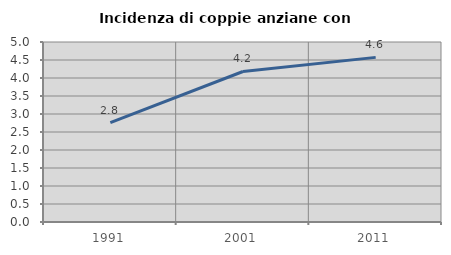
| Category | Incidenza di coppie anziane con figli |
|---|---|
| 1991.0 | 2.759 |
| 2001.0 | 4.181 |
| 2011.0 | 4.573 |